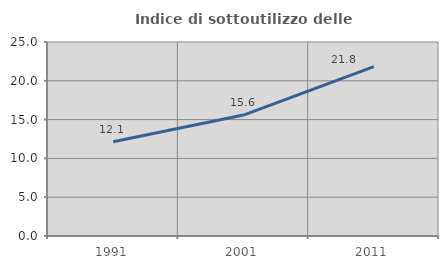
| Category | Indice di sottoutilizzo delle abitazioni  |
|---|---|
| 1991.0 | 12.137 |
| 2001.0 | 15.581 |
| 2011.0 | 21.824 |